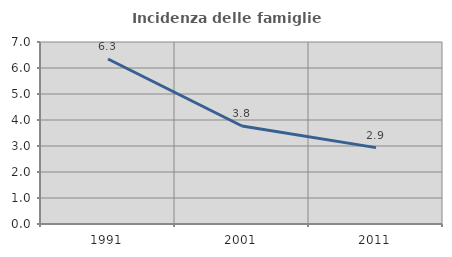
| Category | Incidenza delle famiglie numerose |
|---|---|
| 1991.0 | 6.346 |
| 2001.0 | 3.77 |
| 2011.0 | 2.938 |